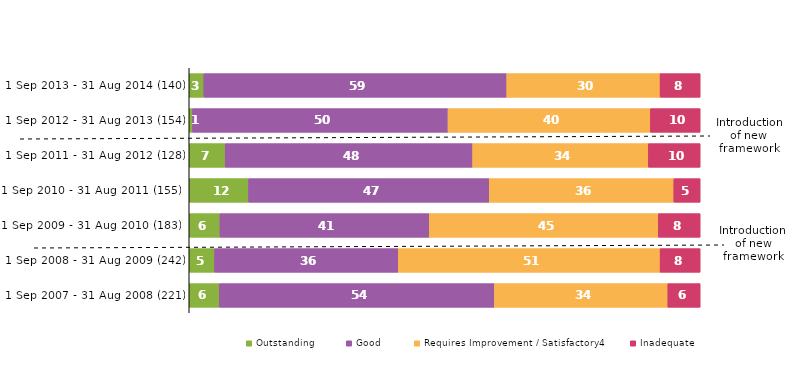
| Category | Outstanding | Good | Requires Improvement / Satisfactory4 | Inadequate |
|---|---|---|---|---|
| 1 Sep 2013 - 31 Aug 2014 (140) | 2.857 | 59.286 | 30 | 7.857 |
| 1 Sep 2012 - 31 Aug 2013 (154) | 0.649 | 50 | 39.61 | 9.74 |
| 1 Sep 2011 - 31 Aug 2012 (128) | 7.031 | 48.438 | 34.375 | 10.156 |
| 1 Sep 2010 - 31 Aug 2011 (155)³ | 11.613 | 47.097 | 36.129 | 5.161 |
| 1 Sep 2009 - 31 Aug 2010 (183)³ | 6.011 | 40.984 | 44.809 | 8.197 |
| 1 Sep 2008 - 31 Aug 2009 (242) | 4.959 | 35.95 | 51.24 | 7.851 |
| 1 Sep 2007 - 31 Aug 2008 (221) | 5.882 | 53.846 | 33.937 | 6.335 |